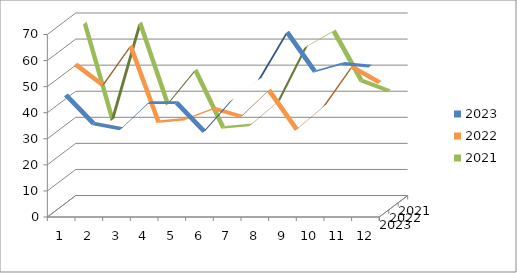
| Category | 2023 | 2022 | 2021 |
|---|---|---|---|
| 0 | 45 | 54 | 67 |
| 1 | 34 | 46 | 30 |
| 2 | 32 | 61 | 67 |
| 3 | 42 | 32 | 36 |
| 4 | 42 | 33 | 49 |
| 5 | 31 | 37 | 27 |
| 6 | 43 | 34 | 28 |
| 7 | 51 | 44 | 37 |
| 8 | 69 | 29 | 58 |
| 9 | 54 | 38 | 64 |
| 10 | 57 | 53 | 45 |
| 11 | 56 | 47 | 41 |